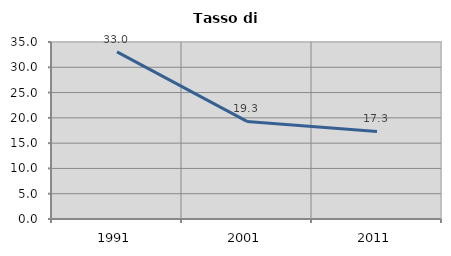
| Category | Tasso di disoccupazione   |
|---|---|
| 1991.0 | 33.045 |
| 2001.0 | 19.298 |
| 2011.0 | 17.317 |